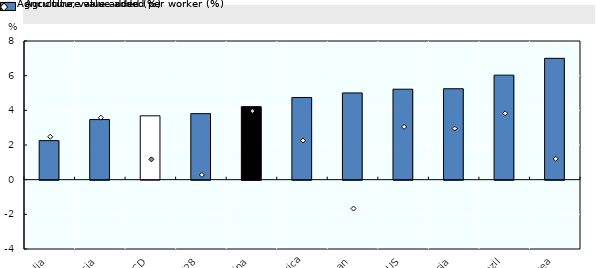
| Category | Agriculture value added per worker (%) |
|---|---|
| Australia | 2.252 |
| Indonesia | 3.468 |
| OECD | 3.683 |
| EU28 | 3.809 |
| China | 4.213 |
| South Africa | 4.74 |
| Japan | 5.004 |
| US | 5.22 |
| Russia | 5.246 |
| Brazil | 6.03 |
| Korea | 7 |